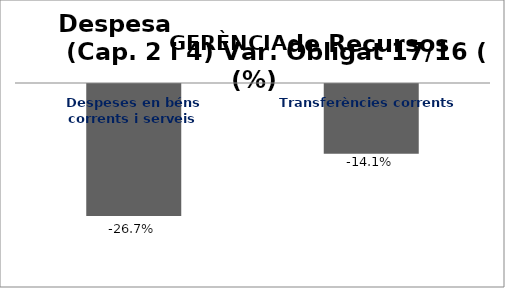
| Category | Series 0 |
|---|---|
| Despeses en béns corrents i serveis | -0.267 |
| Transferències corrents | -0.141 |